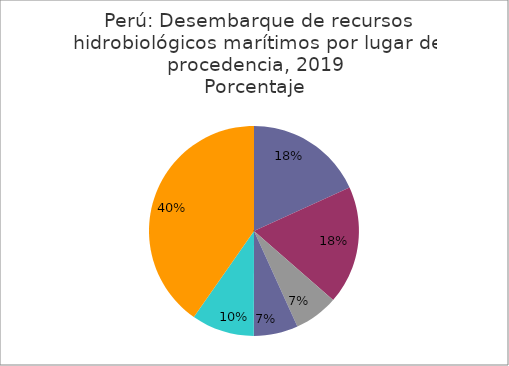
| Category | Series 0 |
|---|---|
| Chicama | 870305.413 |
| Chimbote | 872390.057 |
| Pisco | 325196.993 |
| Callao | 326091.501 |
| Paita  | 462967.487 |
| Otros | 1927736.589 |